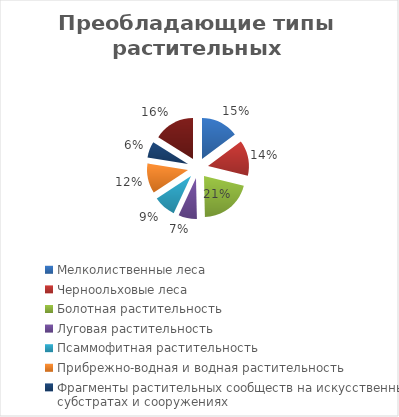
| Category | Series 0 |
|---|---|
| Мелколиственные леса | 14.8 |
| Черноольховые леса | 14.1 |
| Болотная растительность | 20.8 |
| Луговая растительность | 7.3 |
| Псаммофитная растительность | 8.8 |
| Прибрежно-водная и водная растительность | 11.8 |
| Фрагменты растительных сообществ на искусственных субстратах и сооружениях | 6.4 |
| Садоводства и лагеря отдыха | 16.1 |